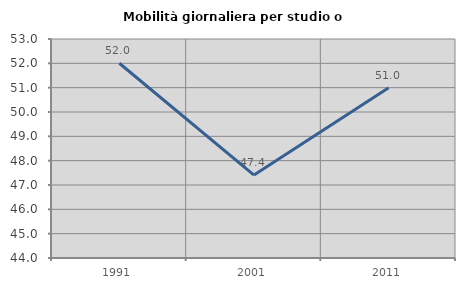
| Category | Mobilità giornaliera per studio o lavoro |
|---|---|
| 1991.0 | 52.002 |
| 2001.0 | 47.406 |
| 2011.0 | 50.999 |